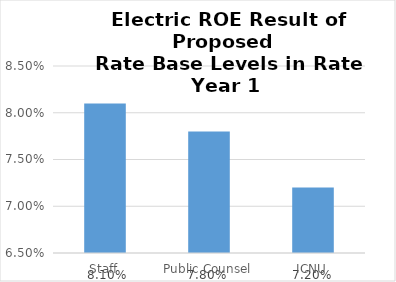
| Category | Electric |
|---|---|
| Staff | 0.081 |
| Public Counsel | 0.078 |
| ICNU | 0.072 |